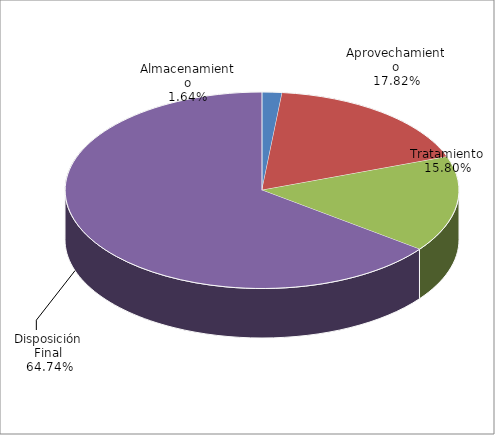
| Category | Series 0 |
|---|---|
| Almacenamiento | 251192.2 |
| Aprovechamiento | 2727302.07 |
| Tratamiento | 2418157.8 |
| Disposición Final | 9909375.32 |